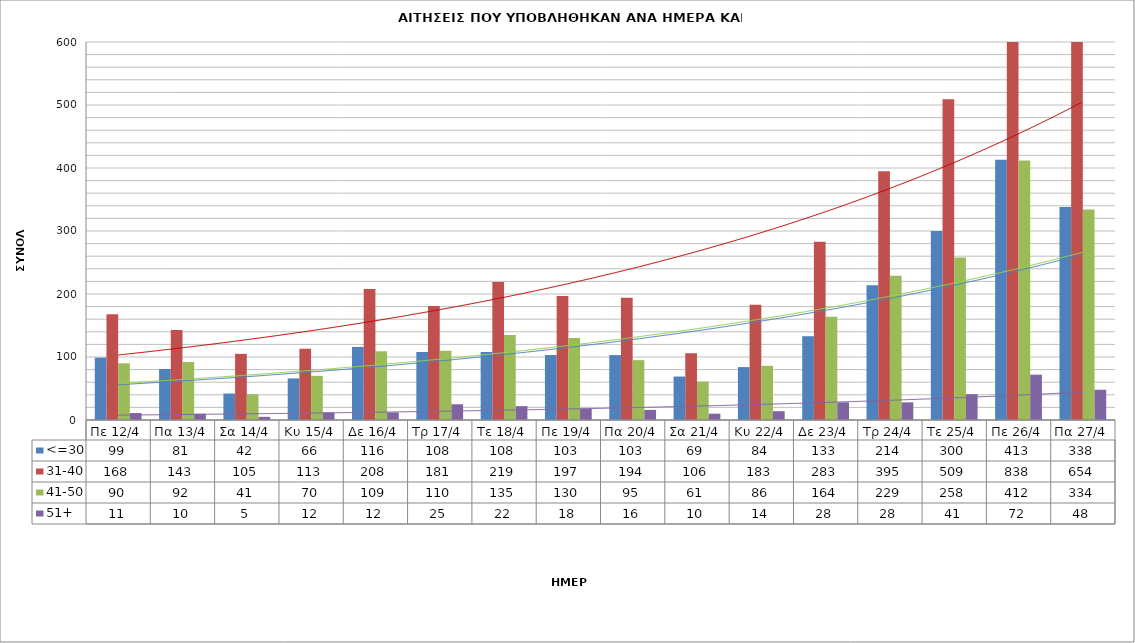
| Category | <=30 | 31-40 | 41-50 | 51+ |
|---|---|---|---|---|
| Πε 12/4 | 99 | 168 | 90 | 11 |
| Πα 13/4 | 81 | 143 | 92 | 10 |
| Σα 14/4 | 42 | 105 | 41 | 5 |
| Κυ 15/4 | 66 | 113 | 70 | 12 |
| Δε 16/4 | 116 | 208 | 109 | 12 |
| Τρ 17/4 | 108 | 181 | 110 | 25 |
| Τε 18/4 | 108 | 219 | 135 | 22 |
| Πε 19/4 | 103 | 197 | 130 | 18 |
| Πα 20/4 | 103 | 194 | 95 | 16 |
| Σα 21/4 | 69 | 106 | 61 | 10 |
| Κυ 22/4 | 84 | 183 | 86 | 14 |
| Δε 23/4 | 133 | 283 | 164 | 28 |
| Τρ 24/4 | 214 | 395 | 229 | 28 |
| Τε 25/4 | 300 | 509 | 258 | 41 |
| Πε 26/4 | 413 | 838 | 412 | 72 |
| Πα 27/4 | 338 | 654 | 334 | 48 |